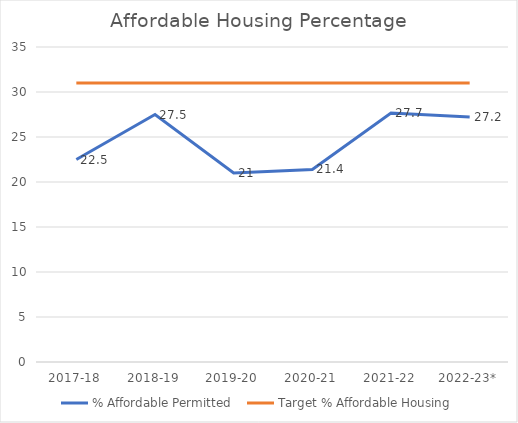
| Category | % Affordable Permitted  | Target % Affordable Housing |
|---|---|---|
| 2017-18 | 22.5 | 31 |
| 2018-19 | 27.5 | 31 |
| 2019-20 | 21 | 31 |
| 2020-21 | 21.4 | 31 |
| 2021-22 | 27.67 | 31 |
| 2022-23* | 27.213 | 31 |